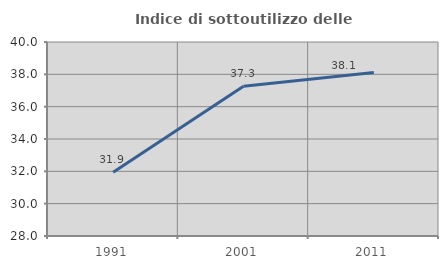
| Category | Indice di sottoutilizzo delle abitazioni  |
|---|---|
| 1991.0 | 31.941 |
| 2001.0 | 37.264 |
| 2011.0 | 38.113 |